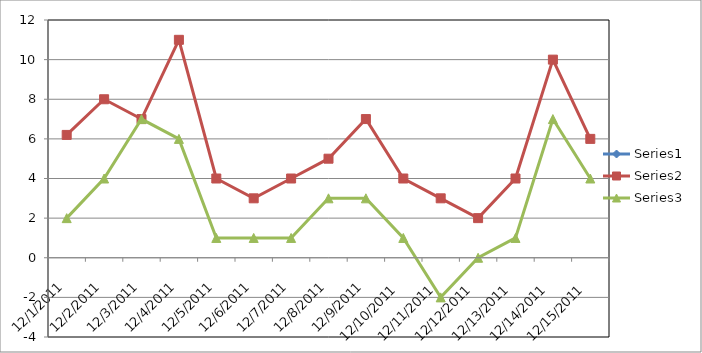
| Category | Series 0 | Series 1 | Series 2 |
|---|---|---|---|
| 12/1/11 |  | 6.2 | 2 |
| 12/2/11 |  | 8 | 4 |
| 12/3/11 |  | 7 | 7 |
| 12/4/11 |  | 11 | 6 |
| 12/5/11 |  | 4 | 1 |
| 12/6/11 |  | 3 | 1 |
| 12/7/11 |  | 4 | 1 |
| 12/8/11 |  | 5 | 3 |
| 12/9/11 |  | 7 | 3 |
| 12/10/11 |  | 4 | 1 |
| 12/11/11 |  | 3 | -2 |
| 12/12/11 |  | 2 | 0 |
| 12/13/11 |  | 4 | 1 |
| 12/14/11 |  | 10 | 7 |
| 12/15/11 |  | 6 | 4 |